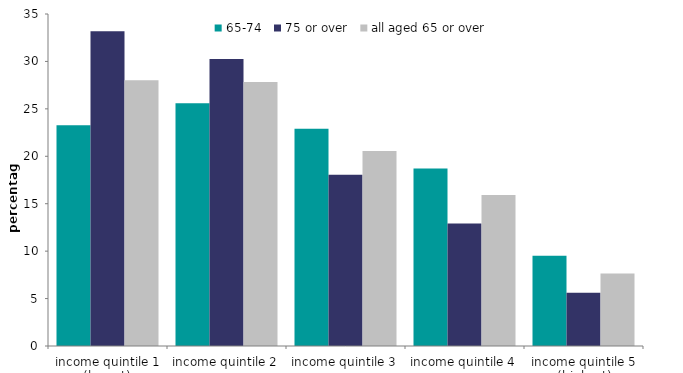
| Category | 65-74 | 75 or over | all aged 65 or over |
|---|---|---|---|
| income quintile 1 (lowest) | 23.269 | 33.18 | 28.029 |
| income quintile 2 | 25.595 | 30.246 | 27.829 |
| income quintile 3 | 22.891 | 18.054 | 20.568 |
| income quintile 4 | 18.72 | 12.914 | 15.931 |
| income quintile 5 (highest) | 9.525 | 5.605 | 7.643 |